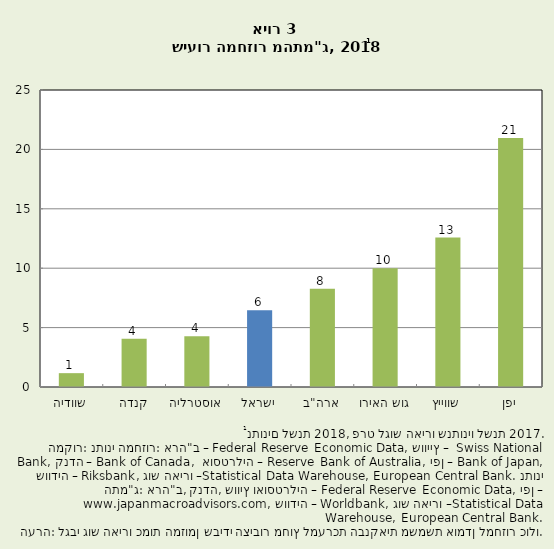
| Category | אחוז מחזור מהתמ"ג לשנת 2018 לפי בנקים מרכזיים וה-OECD |
|---|---|
| שוודיה | 1.165 |
| קנדה | 4.067 |
| אוסטרליה | 4.277 |
| ישראל | 6.468 |
| ארה"ב | 8.262 |
| גוש האירו | 10 |
| שווייץ | 12.581 |
| יפן | 20.966 |